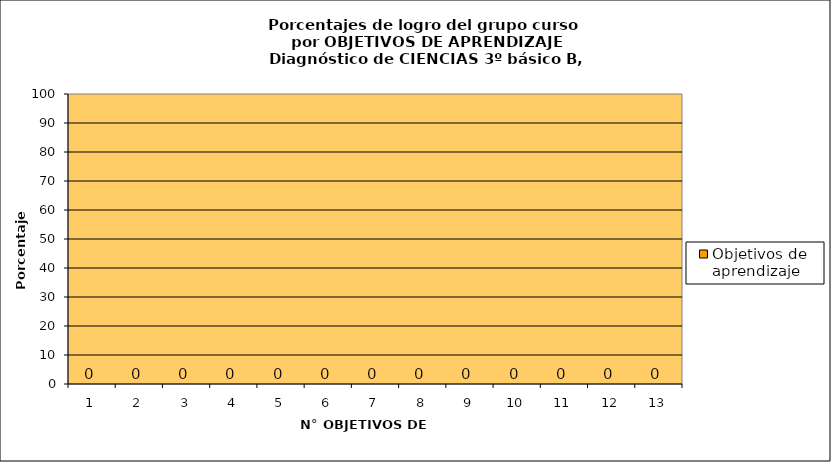
| Category | Objetivos de aprendizaje |
|---|---|
| 0 | 0 |
| 1 | 0 |
| 2 | 0 |
| 3 | 0 |
| 4 | 0 |
| 5 | 0 |
| 6 | 0 |
| 7 | 0 |
| 8 | 0 |
| 9 | 0 |
| 10 | 0 |
| 11 | 0 |
| 12 | 0 |